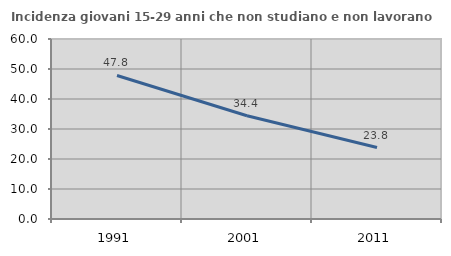
| Category | Incidenza giovani 15-29 anni che non studiano e non lavorano  |
|---|---|
| 1991.0 | 47.841 |
| 2001.0 | 34.416 |
| 2011.0 | 23.81 |